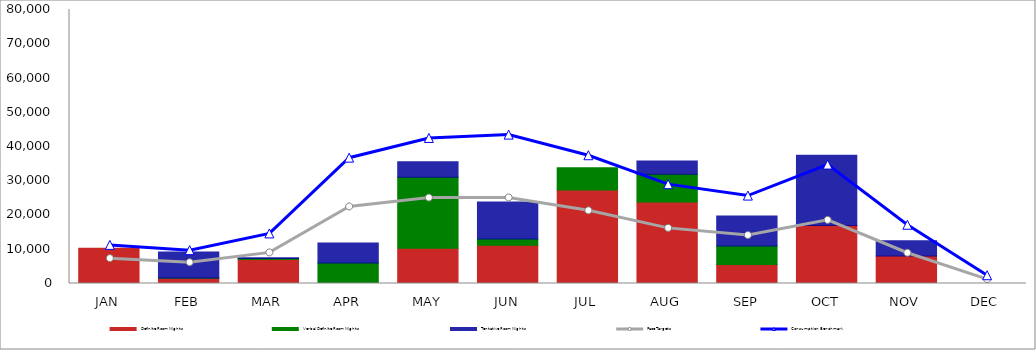
| Category | Definite Room Nights | Verbal Definite Room Nights | Tentative Room Nights |
|---|---|---|---|
| JAN | 10318 | 0 | 0 |
| FEB | 1533 | 100 | 7558 |
| MAR | 7030 | 290 | 185 |
| APR | 25 | 5945 | 5839 |
| MAY | 10290 | 20727 | 4515 |
| JUN | 11200 | 1800 | 10791 |
| JUL | 27289 | 6500 | 0 |
| AUG | 23774 | 8095 | 3897 |
| SEP | 5528 | 5430 | 8750 |
| OCT | 16919 | 0 | 20510 |
| NOV | 8012 | 0 | 4489 |
| DEC | 0 | 0 | 0 |